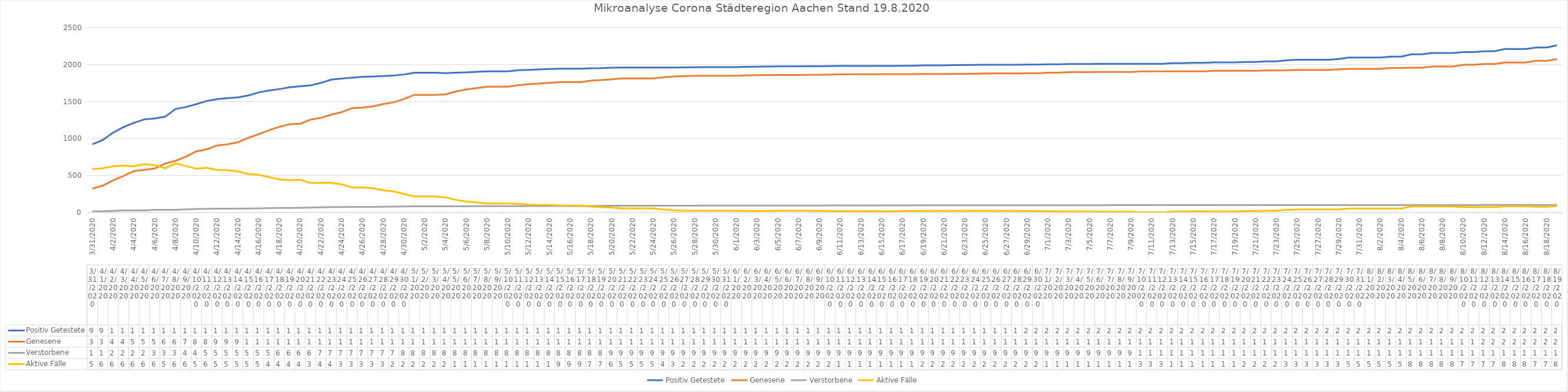
| Category | Positiv Getestete | Genesene | Verstorbene | Aktive Fälle |
|---|---|---|---|---|
| 3/31/20 | 922 | 322 | 15 | 585 |
| 4/1/20 | 980 | 364 | 16 | 600 |
| 4/2/20 | 1081 | 435 | 21 | 625 |
| 4/3/20 | 1155 | 494 | 27 | 634 |
| 4/4/20 | 1213 | 560 | 27 | 626 |
| 4/5/20 | 1259 | 578 | 27 | 654 |
| 4/6/20 | 1272 | 595 | 35 | 642 |
| 4/7/20 | 1295 | 662 | 35 | 598 |
| 4/8/20 | 1399 | 699 | 36 | 664 |
| 4/9/20 | 1426 | 755 | 41 | 630 |
| 4/10/20 | 1465 | 826 | 48 | 591 |
| 4/11/20 | 1508 | 854 | 50 | 604 |
| 4/12/20 | 1532 | 906 | 51 | 575 |
| 4/13/20 | 1547 | 922 | 51 | 574 |
| 4/14/20 | 1557 | 949 | 52 | 556 |
| 4/15/20 | 1583 | 1009 | 54 | 520 |
| 4/16/20 | 1623 | 1058 | 56 | 509 |
| 4/17/20 | 1650 | 1112 | 59 | 479 |
| 4/18/20 | 1669 | 1159 | 62 | 448 |
| 4/19/20 | 1693 | 1195 | 62 | 436 |
| 4/20/20 | 1707 | 1201 | 63 | 443 |
| 4/21/20 | 1719 | 1256 | 65 | 398 |
| 4/22/20 | 1754 | 1281 | 70 | 403 |
| 4/23/20 | 1797 | 1324 | 73 | 400 |
| 4/24/20 | 1812 | 1357 | 74 | 381 |
| 4/25/20 | 1824 | 1412 | 75 | 337 |
| 4/26/20 | 1835 | 1420 | 76 | 339 |
| 4/27/20 | 1839 | 1435 | 76 | 328 |
| 4/28/20 | 1845 | 1467 | 78 | 300 |
| 4/29/20 | 1853 | 1490 | 79 | 284 |
| 4/30/20 | 1866 | 1535 | 82 | 249 |
| 5/1/20 | 1891 | 1591 | 83 | 217 |
| 5/2/20 | 1891 | 1591 | 83 | 217 |
| 5/3/20 | 1891 | 1591 | 83 | 217 |
| 5/4/20 | 1885 | 1598 | 83 | 204 |
| 5/5/20 | 1890 | 1636 | 84 | 170 |
| 5/6/20 | 1895 | 1664 | 84 | 147 |
| 5/7/20 | 1903 | 1682 | 85 | 136 |
| 5/8/20 | 1909 | 1702 | 85 | 122 |
| 5/9/20 | 1909 | 1702 | 85 | 122 |
| 5/10/20 | 1909 | 1702 | 85 | 122 |
| 5/11/20 | 1924 | 1721 | 86 | 117 |
| 5/12/20 | 1929 | 1736 | 87 | 106 |
| 5/13/20 | 1934 | 1743 | 87 | 104 |
| 5/14/20 | 1941 | 1753 | 87 | 101 |
| 5/15/20 | 1945 | 1764 | 88 | 93 |
| 5/16/20 | 1945 | 1764 | 88 | 93 |
| 5/17/20 | 1945 | 1764 | 88 | 93 |
| 5/18/20 | 1951 | 1784 | 88 | 79 |
| 5/19/20 | 1952 | 1791 | 89 | 72 |
| 5/20/20 | 1958 | 1801 | 91 | 66 |
| 5/21/20 | 1960 | 1814 | 91 | 55 |
| 5/22/20 | 1960 | 1814 | 91 | 55 |
| 5/23/20 | 1960 | 1814 | 91 | 55 |
| 5/24/20 | 1960 | 1814 | 91 | 55 |
| 5/25/20 | 1960 | 1829 | 91 | 40 |
| 5/26/20 | 1960 | 1839 | 91 | 30 |
| 5/27/20 | 1962 | 1846 | 92 | 24 |
| 5/28/20 | 1964 | 1849 | 92 | 23 |
| 5/29/20 | 1967 | 1850 | 93 | 24 |
| 5/30/20 | 1967 | 1850 | 93 | 24 |
| 5/31/20 | 1967 | 1850 | 93 | 24 |
| 6/1/20 | 1967 | 1850 | 93 | 24 |
| 6/2/20 | 1971 | 1856 | 93 | 22 |
| 6/3/20 | 1972 | 1858 | 94 | 20 |
| 6/4/20 | 1975 | 1859 | 94 | 22 |
| 6/5/20 | 1976 | 1859 | 94 | 23 |
| 6/6/20 | 1976 | 1859 | 94 | 23 |
| 6/7/20 | 1976 | 1859 | 94 | 23 |
| 6/8/20 | 1979 | 1862 | 94 | 23 |
| 6/9/20 | 1979 | 1863 | 94 | 22 |
| 6/10/20 | 1980 | 1865 | 95 | 20 |
| 6/11/20 | 1982 | 1869 | 95 | 18 |
| 6/12/20 | 1982 | 1869 | 95 | 18 |
| 6/13/20 | 1982 | 1869 | 95 | 18 |
| 6/14/20 | 1982 | 1869 | 95 | 18 |
| 6/15/20 | 1982 | 1871 | 95 | 16 |
| 6/16/20 | 1982 | 1871 | 95 | 16 |
| 6/17/20 | 1985 | 1871 | 95 | 19 |
| 6/18/20 | 1985 | 1871 | 95 | 19 |
| 6/19/20 | 1991 | 1873 | 97 | 21 |
| 6/20/20 | 1991 | 1873 | 97 | 21 |
| 6/21/20 | 1991 | 1873 | 97 | 21 |
| 6/22/20 | 1994 | 1875 | 97 | 22 |
| 6/23/20 | 1994 | 1875 | 97 | 22 |
| 6/24/20 | 1997 | 1876 | 98 | 23 |
| 6/25/20 | 1999 | 1880 | 98 | 21 |
| 6/26/20 | 1999 | 1880 | 98 | 21 |
| 6/27/20 | 1999 | 1880 | 98 | 21 |
| 6/28/20 | 1999 | 1880 | 98 | 21 |
| 6/29/20 | 2001 | 1883 | 98 | 20 |
| 6/30/20 | 2001 | 1883 | 98 | 20 |
| 7/1/20 | 2004 | 1890 | 98 | 16 |
| 7/2/20 | 2004 | 1890 | 98 | 16 |
| 7/3/20 | 2009 | 1898 | 98 | 13 |
| 7/4/20 | 2009 | 1898 | 98 | 13 |
| 7/5/20 | 2009 | 1898 | 98 | 13 |
| 7/6/20 | 2010 | 1900 | 98 | 12 |
| 7/7/20 | 2010 | 1900 | 99 | 11 |
| 7/8/20 | 2010 | 1900 | 99 | 11 |
| 7/9/20 | 2010 | 1900 | 99 | 11 |
| 7/10/20 | 2011 | 1908 | 100 | 3 |
| 7/11/20 | 2011 | 1908 | 100 | 3 |
| 7/12/20 | 2011 | 1908 | 100 | 3 |
| 7/13/20 | 2021 | 1908 | 100 | 13 |
| 7/14/20 | 2021 | 1908 | 100 | 13 |
| 7/15/20 | 2025 | 1909 | 100 | 16 |
| 7/16/20 | 2025 | 1909 | 100 | 16 |
| 7/17/20 | 2030 | 1917 | 100 | 13 |
| 7/18/20 | 2030 | 1917 | 100 | 13 |
| 7/19/20 | 2030 | 1917 | 100 | 13 |
| 7/20/20 | 2037 | 1917 | 100 | 20 |
| 7/21/20 | 2037 | 1917 | 100 | 20 |
| 7/22/20 | 2044 | 1920 | 100 | 24 |
| 7/23/20 | 2044 | 1920 | 100 | 24 |
| 7/24/20 | 2058 | 1922 | 100 | 36 |
| 7/25/20 | 2067 | 1928 | 100 | 39 |
| 7/26/20 | 2067 | 1928 | 100 | 39 |
| 7/27/20 | 2067 | 1928 | 100 | 39 |
| 7/28/20 | 2067 | 1928 | 100 | 39 |
| 7/29/20 | 2076 | 1937 | 100 | 39 |
| 7/30/20 | 2095 | 1942 | 100 | 53 |
| 7/31/20 | 2095 | 1942 | 100 | 53 |
| 8/1/20 | 2095 | 1942 | 100 | 53 |
| 8/2/20 | 2095 | 1942 | 100 | 53 |
| 8/3/20 | 2108 | 1954 | 100 | 54 |
| 8/4/20 | 2108 | 1954 | 100 | 54 |
| 8/5/20 | 2139 | 1958 | 100 | 81 |
| 8/6/20 | 2139 | 1958 | 100 | 81 |
| 8/7/20 | 2157 | 1975 | 100 | 82 |
| 8/8/20 | 2157 | 1975 | 100 | 82 |
| 8/9/20 | 2157 | 1975 | 100 | 82 |
| 8/10/20 | 2170 | 1999 | 100 | 71 |
| 8/11/20 | 2170 | 1999 | 100 | 71 |
| 8/12/20 | 2181 | 2008 | 101 | 72 |
| 8/13/20 | 2181 | 2008 | 101 | 72 |
| 8/14/20 | 2212 | 2028 | 101 | 83 |
| 8/15/20 | 2212 | 2028 | 101 | 83 |
| 8/16/20 | 2212 | 2028 | 101 | 83 |
| 8/17/20 | 2232 | 2053 | 101 | 78 |
| 8/18/20 | 2232 | 2053 | 101 | 78 |
| 8/19/20 | 2261 | 2074 | 102 | 85 |